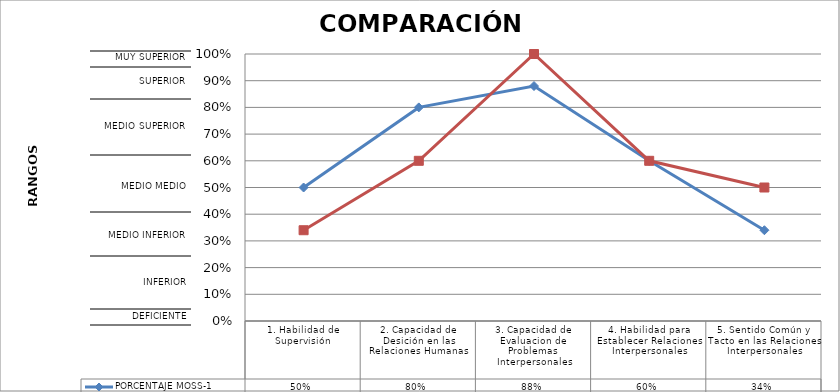
| Category | PORCENTAJE MOSS-1 | PORCENTAJE MOSS-1 FINAL |
|---|---|---|
| 1. Habilidad de Supervisión | 0.5 | 0.34 |
| 2. Capacidad de Desición en las Relaciones Humanas | 0.8 | 0.6 |
| 3. Capacidad de Evaluacion de Problemas Interpersonales | 0.88 | 1 |
| 4. Habilidad para Establecer Relaciones Interpersonales | 0.6 | 0.6 |
| 5. Sentido Común y Tacto en las Relaciones Interpersonales | 0.34 | 0.5 |